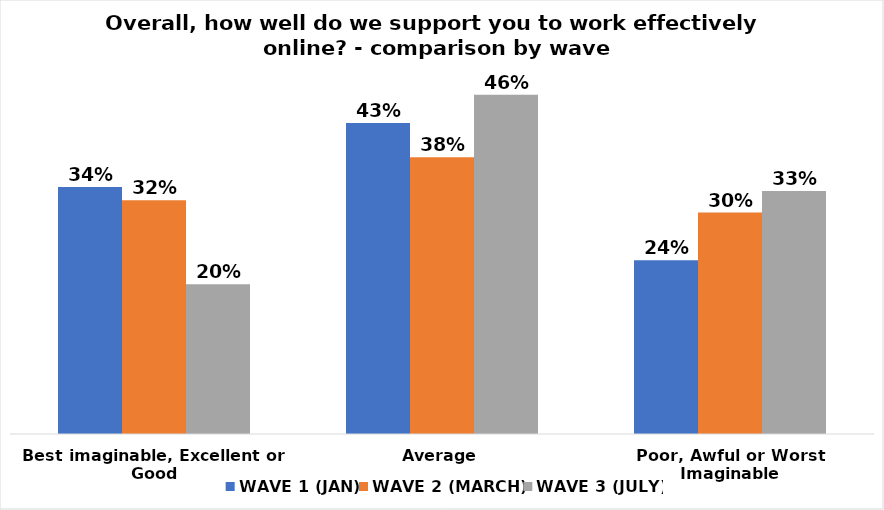
| Category | WAVE 1 (JAN) | WAVE 2 (MARCH) | WAVE 3 (JULY) |
|---|---|---|---|
| Best imaginable, Excellent or Good | 0.338 | 0.319 | 0.205 |
| Average | 0.425 | 0.378 | 0.463 |
| Poor, Awful or Worst Imaginable | 0.238 | 0.303 | 0.332 |